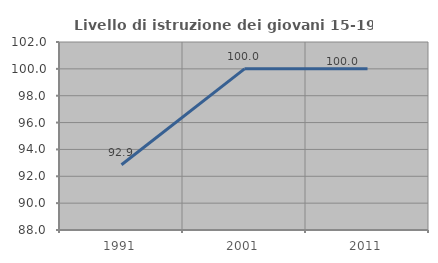
| Category | Livello di istruzione dei giovani 15-19 anni |
|---|---|
| 1991.0 | 92.857 |
| 2001.0 | 100 |
| 2011.0 | 100 |